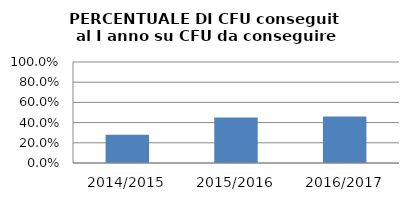
| Category | 2014/2015 2015/2016 2016/2017 |
|---|---|
| 2014/2015 | 0.279 |
| 2015/2016 | 0.451 |
| 2016/2017 | 0.46 |